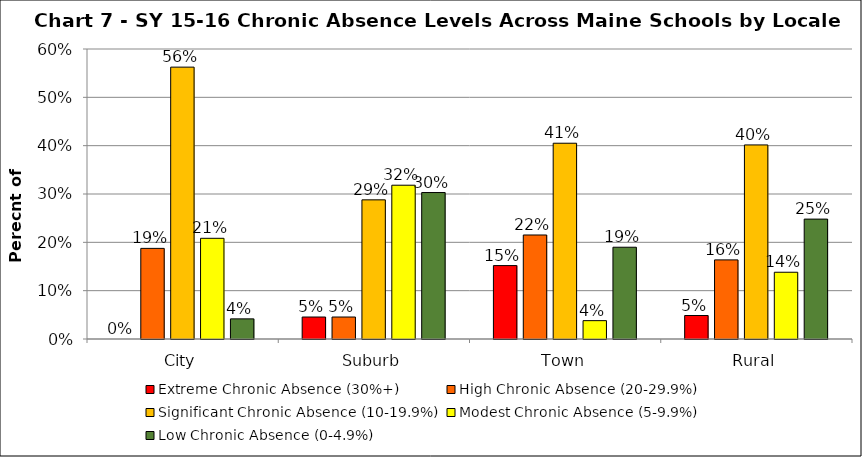
| Category | Extreme Chronic Absence (30%+) | High Chronic Absence (20-29.9%) | Significant Chronic Absence (10-19.9%) | Modest Chronic Absence (5-9.9%) | Low Chronic Absence (0-4.9%) |
|---|---|---|---|---|---|
| 0 | 0 | 0.188 | 0.562 | 0.208 | 0.042 |
| 1 | 0.045 | 0.045 | 0.288 | 0.318 | 0.303 |
| 2 | 0.152 | 0.215 | 0.405 | 0.038 | 0.19 |
| 3 | 0.049 | 0.164 | 0.402 | 0.138 | 0.248 |